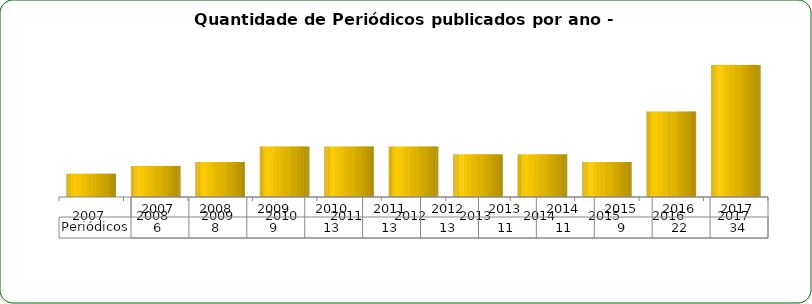
| Category | Periódicos |
|---|---|
| 2007.0 | 6 |
| 2008.0 | 8 |
| 2009.0 | 9 |
| 2010.0 | 13 |
| 2011.0 | 13 |
| 2012.0 | 13 |
| 2013.0 | 11 |
| 2014.0 | 11 |
| 2015.0 | 9 |
| 2016.0 | 22 |
| 2017.0 | 34 |